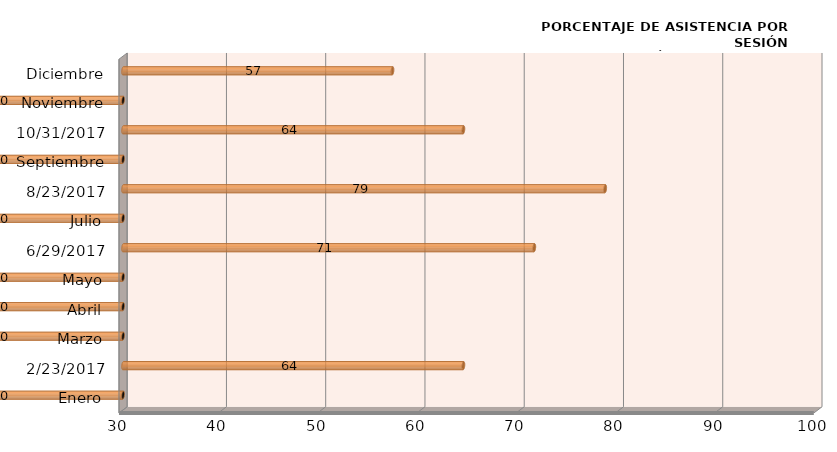
| Category | Series 0 |
|---|---|
| Enero | 0 |
| 23/02/2017 | 64.286 |
| Marzo | 0 |
| Abril | 0 |
| Mayo | 0 |
| 29/06/2017 | 71.429 |
| Julio | 0 |
| 23/08/2017 | 78.571 |
| Septiembre | 0 |
| 31/10/2017 | 64.286 |
| Noviembre | 0 |
| Diciembre | 57.143 |